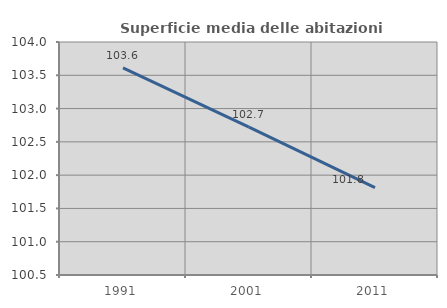
| Category | Superficie media delle abitazioni occupate |
|---|---|
| 1991.0 | 103.611 |
| 2001.0 | 102.721 |
| 2011.0 | 101.814 |